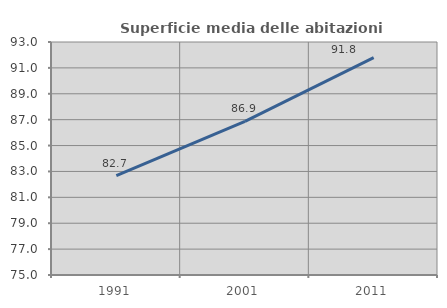
| Category | Superficie media delle abitazioni occupate |
|---|---|
| 1991.0 | 82.683 |
| 2001.0 | 86.871 |
| 2011.0 | 91.79 |